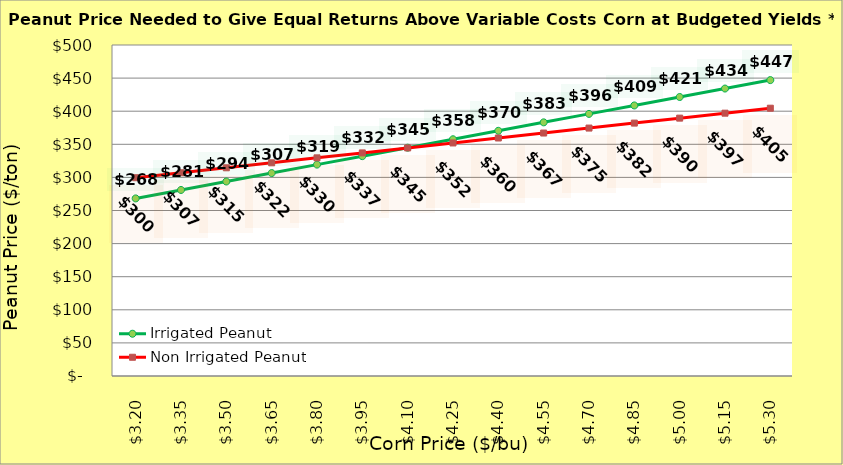
| Category | Irrigated Peanut | Non Irrigated Peanut |
|---|---|---|
| 3.2 | 268.264 | 299.519 |
| 3.35 | 281.03 | 307.019 |
| 3.5 | 293.796 | 314.519 |
| 3.65 | 306.562 | 322.019 |
| 3.8 | 319.328 | 329.519 |
| 3.9499999999999997 | 332.094 | 337.019 |
| 4.1 | 344.86 | 344.519 |
| 4.25 | 357.626 | 352.019 |
| 4.4 | 370.392 | 359.519 |
| 4.550000000000001 | 383.158 | 367.019 |
| 4.700000000000001 | 395.924 | 374.519 |
| 4.850000000000001 | 408.69 | 382.019 |
| 5.000000000000002 | 421.456 | 389.519 |
| 5.150000000000002 | 434.222 | 397.019 |
| 5.3000000000000025 | 446.988 | 404.519 |